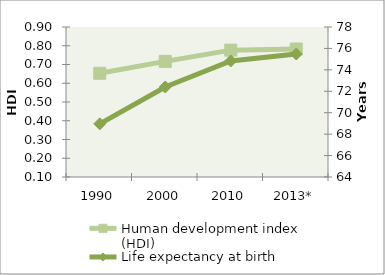
| Category | Human development index (HDI) |
|---|---|
| 1990 | 0.653 |
| 2000 | 0.717 |
| 2010 | 0.777 |
| 2013* | 0.782 |